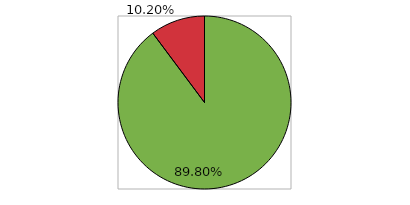
| Category | Series 0 |
|---|---|
| 0 | 0.898 |
| 1 | 0.102 |
| 2 | 0 |